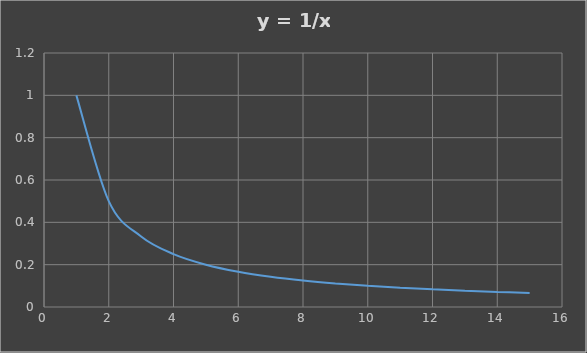
| Category | Series 0 |
|---|---|
| 1.0 | 1 |
| 2.0 | 0.5 |
| 3.0 | 0.333 |
| 4.0 | 0.25 |
| 5.0 | 0.2 |
| 6.0 | 0.167 |
| 7.0 | 0.143 |
| 8.0 | 0.125 |
| 9.0 | 0.111 |
| 10.0 | 0.1 |
| 11.0 | 0.091 |
| 12.0 | 0.083 |
| 13.0 | 0.077 |
| 14.0 | 0.071 |
| 15.0 | 0.067 |